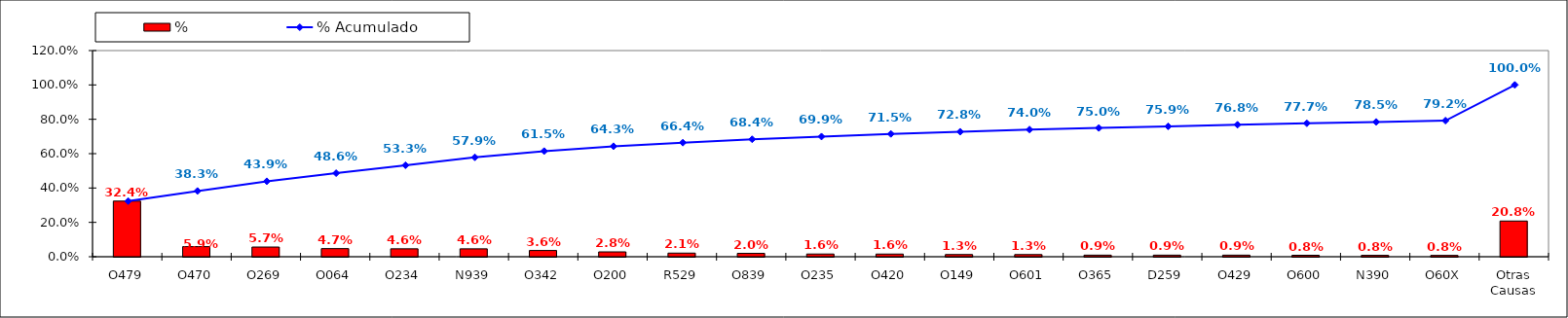
| Category | % |
|---|---|
| O479 | 0.324 |
| O470 | 0.059 |
| O269 | 0.057 |
| O064 | 0.047 |
| O234 | 0.046 |
| N939 | 0.046 |
| O342 | 0.036 |
| O200 | 0.028 |
| R529 | 0.021 |
| O839 | 0.02 |
| O235 | 0.016 |
| O420 | 0.016 |
| O149 | 0.013 |
| O601 | 0.013 |
| O365 | 0.009 |
| D259 | 0.009 |
| O429 | 0.009 |
| O600 | 0.008 |
| N390 | 0.008 |
| O60X | 0.008 |
| Otras Causas | 0.208 |